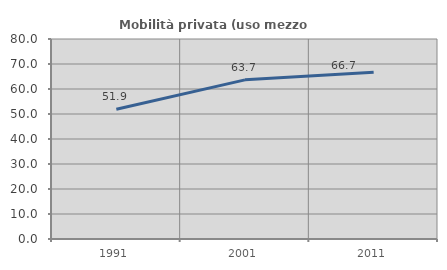
| Category | Mobilità privata (uso mezzo privato) |
|---|---|
| 1991.0 | 51.875 |
| 2001.0 | 63.651 |
| 2011.0 | 66.729 |